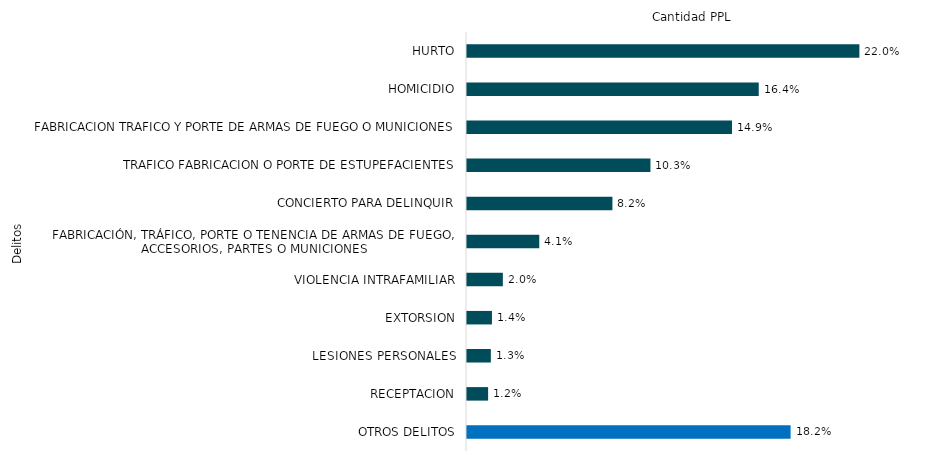
| Category | Series 0 |
|---|---|
| HURTO | 2156 |
| HOMICIDIO | 1603 |
| FABRICACION TRAFICO Y PORTE DE ARMAS DE FUEGO O MUNICIONES | 1456 |
| TRAFICO FABRICACION O PORTE DE ESTUPEFACIENTES | 1008 |
| CONCIERTO PARA DELINQUIR | 799 |
| FABRICACIÓN, TRÁFICO, PORTE O TENENCIA DE ARMAS DE FUEGO, ACCESORIOS, PARTES O MUNICIONES | 397 |
| VIOLENCIA INTRAFAMILIAR | 197 |
| EXTORSION | 137 |
| LESIONES PERSONALES | 131 |
| RECEPTACION | 116 |
| OTROS DELITOS | 1778 |